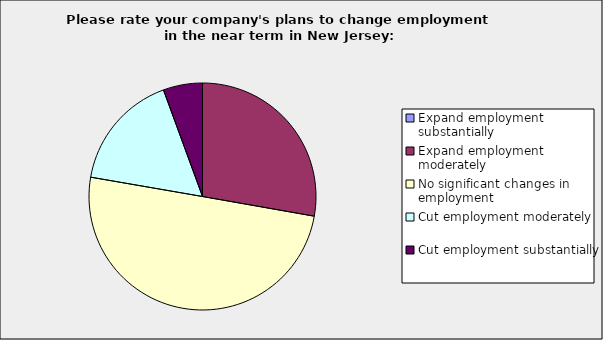
| Category | Series 0 |
|---|---|
| Expand employment substantially | 0 |
| Expand employment moderately | 0.278 |
| No significant changes in employment | 0.5 |
| Cut employment moderately | 0.167 |
| Cut employment substantially | 0.056 |